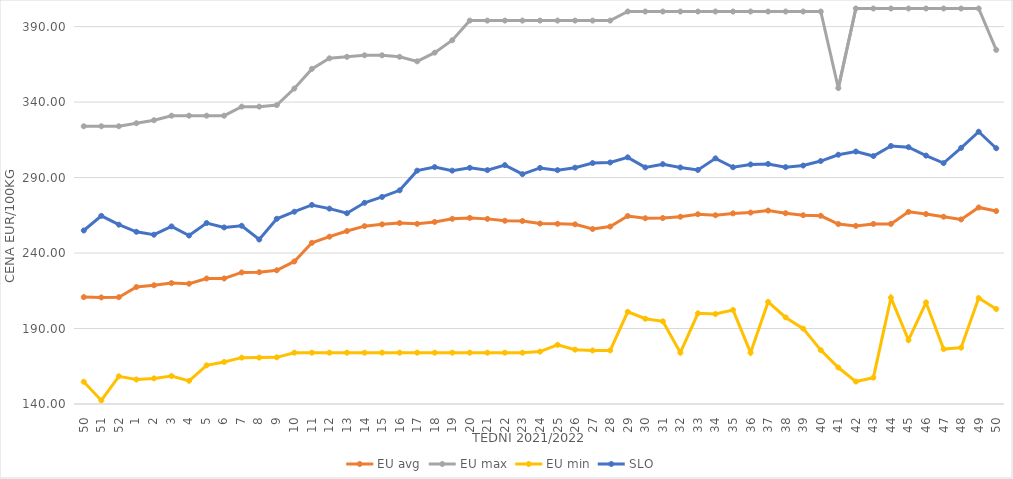
| Category | EU avg | EU max | EU min | SLO |
|---|---|---|---|---|
| 50.0 | 210.823 | 324 | 154.698 | 254.94 |
| 51.0 | 210.59 | 324 | 142.382 | 264.65 |
| 52.0 | 210.763 | 324 | 158.333 | 258.8 |
| 1.0 | 217.519 | 326 | 156.222 | 254.09 |
| 2.0 | 218.654 | 328 | 156.969 | 252.15 |
| 3.0 | 220.098 | 331 | 158.511 | 257.65 |
| 4.0 | 219.685 | 331 | 155.346 | 251.6 |
| 5.0 | 223.143 | 331 | 165.59 | 259.87 |
| 6.0 | 223.178 | 331 | 167.86 | 256.97 |
| 7.0 | 227.145 | 337 | 170.719 | 258.07 |
| 8.0 | 227.312 | 337 | 170.743 | 248.97 |
| 9.0 | 228.588 | 338 | 170.92 | 262.72 |
| 10.0 | 234.434 | 349 | 174 | 267.38 |
| 11.0 | 246.762 | 362 | 174 | 271.86 |
| 12.0 | 250.845 | 369 | 174 | 269.43 |
| 13.0 | 254.568 | 370 | 174 | 266.39 |
| 14.0 | 257.819 | 371 | 174 | 273.3 |
| 15.0 | 259 | 371 | 174 | 277.18 |
| 16.0 | 259.873 | 370 | 174 | 281.55 |
| 17.0 | 259.351 | 367 | 174 | 294.59 |
| 18.0 | 260.6 | 372.758 | 174 | 296.93 |
| 19.0 | 262.669 | 381 | 174 | 294.6 |
| 20.0 | 263.291 | 394 | 174 | 296.48 |
| 21.0 | 262.64 | 394 | 174 | 294.94 |
| 22.0 | 261.388 | 394 | 174 | 298.26 |
| 23.0 | 261.228 | 394 | 174 | 292.27 |
| 24.0 | 259.544 | 394 | 174.72 | 296.39 |
| 25.0 | 259.395 | 394 | 179.2 | 294.93 |
| 26.0 | 259.018 | 394 | 176 | 296.56 |
| 27.0 | 255.922 | 394 | 175.451 | 299.59 |
| 28.0 | 257.564 | 394 | 175.52 | 300.01 |
| 29.0 | 264.52 | 400 | 201.097 | 303.41 |
| 30.0 | 263.067 | 400 | 196.496 | 296.73 |
| 31.0 | 263.196 | 400 | 194.756 | 298.88 |
| 32.0 | 264.059 | 400 | 174 | 296.7 |
| 33.0 | 265.729 | 400 | 200.07 | 295.05 |
| 34.0 | 265.016 | 400 | 199.637 | 302.73 |
| 35.0 | 266.273 | 400 | 202.277 | 296.86 |
| 36.0 | 266.807 | 400 | 174 | 298.7 |
| 37.0 | 268.136 | 400 | 207.594 | 299.02 |
| 38.0 | 266.39 | 400 | 197.352 | 296.91 |
| 39.0 | 265.059 | 400 | 189.926 | 297.96 |
| 40.0 | 264.682 | 400 | 175.723 | 300.95 |
| 41.0 | 259.22 | 349.29 | 164.165 | 305.13 |
| 42.0 | 258.007 | 402 | 154.869 | 307.26 |
| 43.0 | 259.298 | 402 | 157.459 | 304.27 |
| 44.0 | 259.315 | 402 | 210.415 | 310.93 |
| 45.0 | 267.294 | 402 | 182.35 | 310.16 |
| 46.0 | 265.833 | 402 | 207.247 | 304.58 |
| 47.0 | 264.07 | 402 | 176.378 | 299.59 |
| 48.0 | 262.268 | 402 | 177.332 | 309.69 |
| 49.0 | 270.195 | 402 | 210.19 | 320.38 |
| 50.0 | 267.809 | 374.58 | 202.952 | 309.44 |